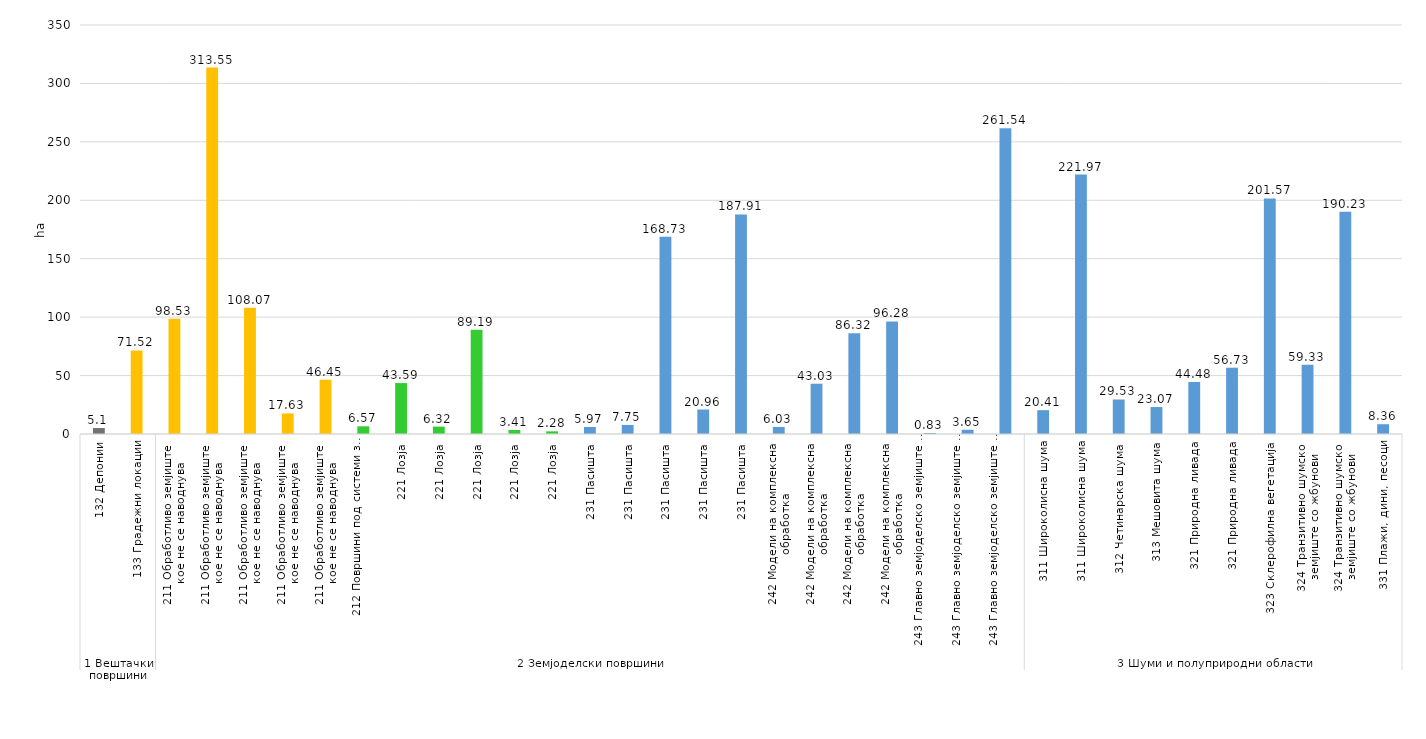
| Category | Series 0 |
|---|---|
| 0 | 5.1 |
| 1 | 71.52 |
| 2 | 98.53 |
| 3 | 313.55 |
| 4 | 108.07 |
| 5 | 17.63 |
| 6 | 46.45 |
| 7 | 6.57 |
| 8 | 43.59 |
| 9 | 6.32 |
| 10 | 89.19 |
| 11 | 3.41 |
| 12 | 2.28 |
| 13 | 5.97 |
| 14 | 7.75 |
| 15 | 168.73 |
| 16 | 20.96 |
| 17 | 187.91 |
| 18 | 6.03 |
| 19 | 43.03 |
| 20 | 86.32 |
| 21 | 96.28 |
| 22 | 0.83 |
| 23 | 3.65 |
| 24 | 261.54 |
| 25 | 20.41 |
| 26 | 221.97 |
| 27 | 29.53 |
| 28 | 23.07 |
| 29 | 44.48 |
| 30 | 56.73 |
| 31 | 201.57 |
| 32 | 59.33 |
| 33 | 190.23 |
| 34 | 8.36 |